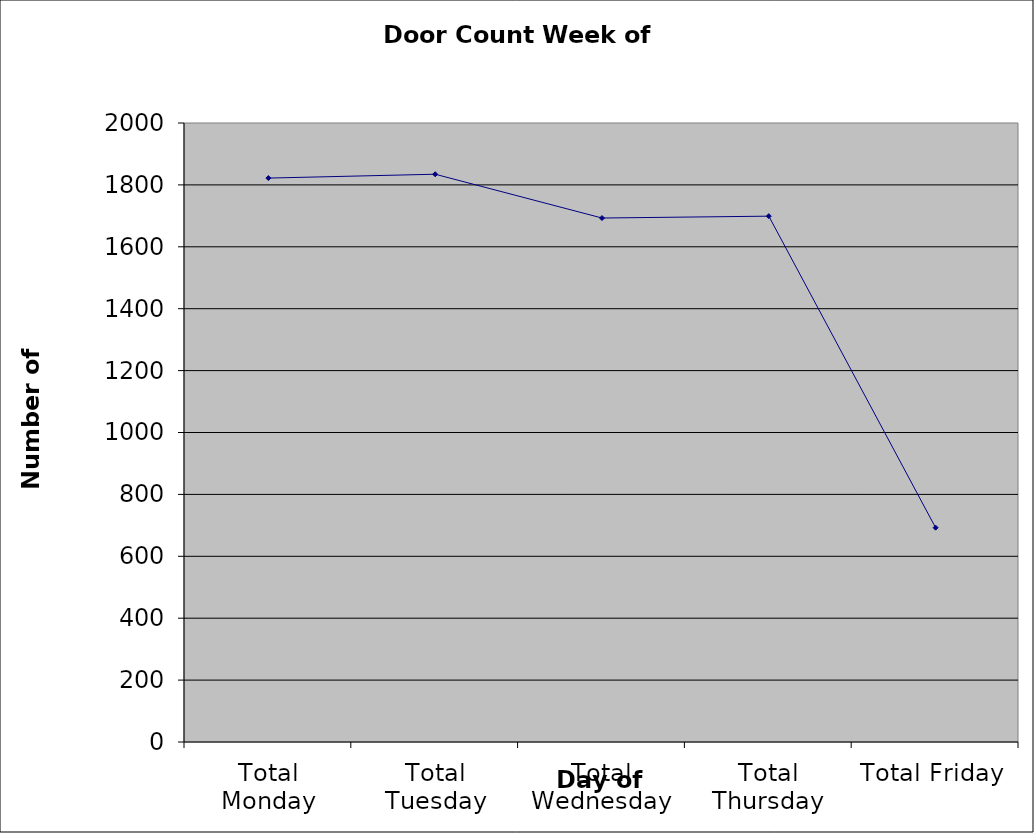
| Category | Series 0 |
|---|---|
| Total Monday | 1822 |
| Total Tuesday | 1834.5 |
| Total Wednesday | 1693 |
| Total Thursday | 1699 |
| Total Friday | 692.5 |